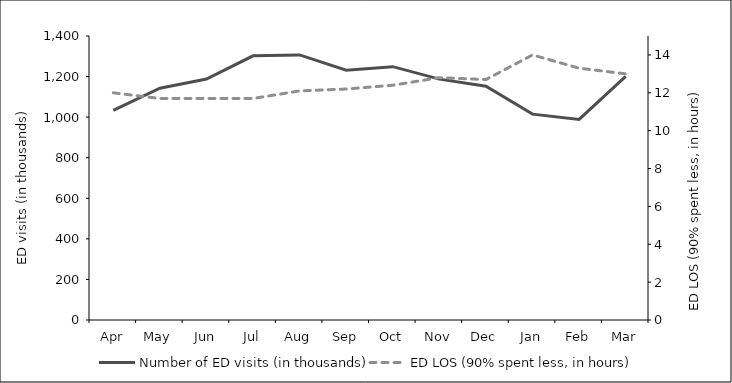
| Category | Number of ED visits (in thousands) |
|---|---|
| Apr | 1033.346 |
| May | 1142.626 |
| Jun | 1187.77 |
| Jul | 1302.067 |
| Aug | 1306.861 |
| Sep | 1231.603 |
| Oct | 1248.824 |
| Nov | 1187.377 |
| Dec | 1152.352 |
| Jan | 1014.884 |
| Feb | 988.969 |
| Mar | 1201.227 |